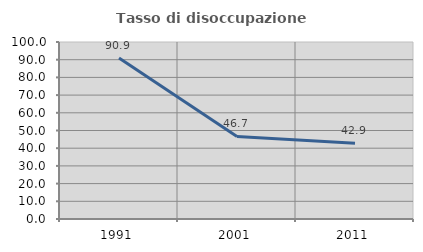
| Category | Tasso di disoccupazione giovanile  |
|---|---|
| 1991.0 | 90.909 |
| 2001.0 | 46.667 |
| 2011.0 | 42.857 |